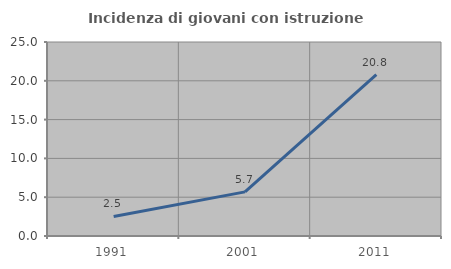
| Category | Incidenza di giovani con istruzione universitaria |
|---|---|
| 1991.0 | 2.525 |
| 2001.0 | 5.687 |
| 2011.0 | 20.8 |